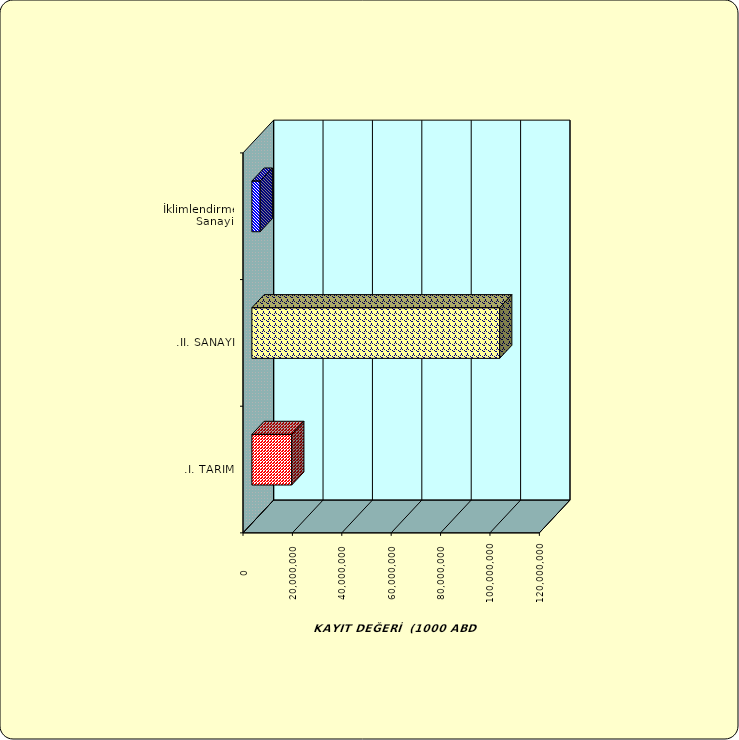
| Category | Series 0 |
|---|---|
| .I. TARIM | 16120844.821 |
| .II. SANAYİ | 100315161.746 |
|  İklimlendirme Sanayii | 3350647.903 |